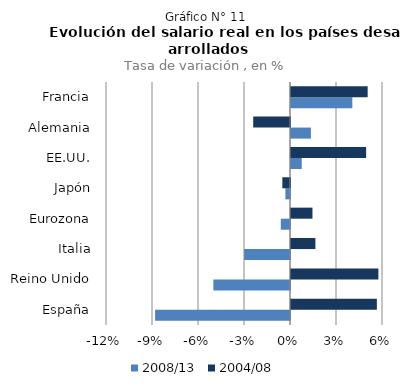
| Category | 2008/13 | 2004/08 |
|---|---|---|
| España | -0.088 | 0.056 |
| Reino Unido | -0.05 | 0.057 |
| Italia | -0.03 | 0.016 |
| Eurozona | -0.006 | 0.014 |
| Japón | -0.003 | -0.005 |
| EE.UU. | 0.007 | 0.049 |
| Alemania | 0.013 | -0.024 |
| Francia | 0.04 | 0.05 |